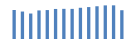
| Category | Exportações (1) |
|---|---|
| 0 | 392293.987 |
| 1 | 370979.678 |
| 2 | 344221.998 |
| 3 | 386156.652 |
| 4 | 390987.572 |
| 5 | 406063.094 |
| 6 | 407598.054 |
| 7 | 406953.169 |
| 8 | 421887.391 |
| 9 | 431264.801 |
| 10 | 442364.452 |
| 11 | 454202.095 |
| 12 | 454929.952 |
| 13 | 388772.928 |